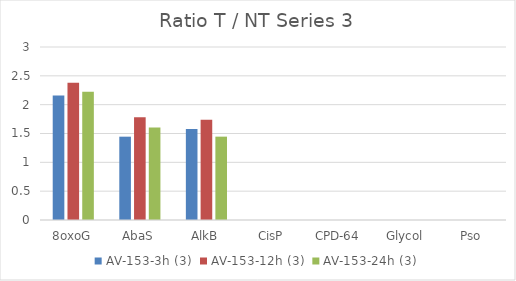
| Category | AV-153-3h (3) | AV-153-12h (3) | AV-153-24h (3) |
|---|---|---|---|
| 8oxoG | 2.161 | 2.38 | 2.225 |
| AbaS | 1.445 | 1.782 | 1.605 |
| AlkB | 1.577 | 1.738 | 1.445 |
| CisP | 0 | 0 | 0 |
| CPD-64 | 0 | 0 | 0 |
| Glycol | 0 | 0 | 0 |
| Pso | 0 | 0 | 0 |